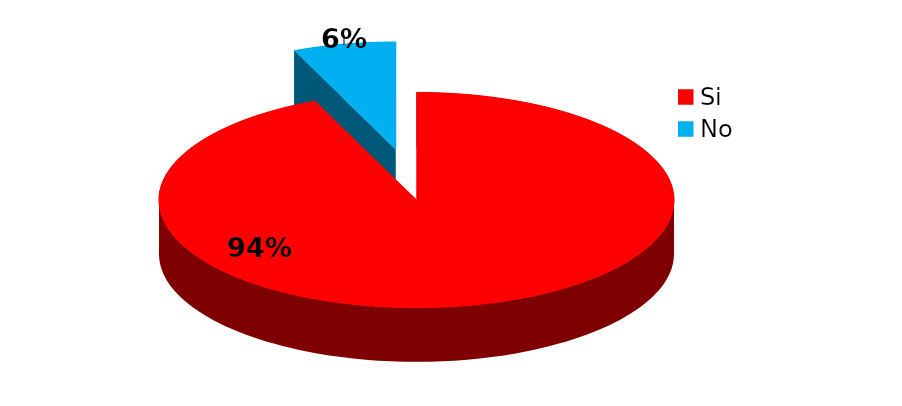
| Category | Series 0 |
|---|---|
| Si | 58 |
| No | 4 |